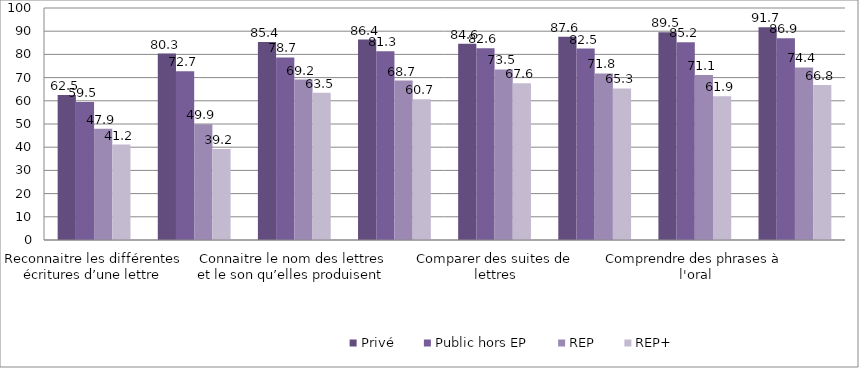
| Category | Privé | Public hors EP | REP | REP+ |
|---|---|---|---|---|
| Reconnaitre les différentes écritures d’une lettre | 62.51 | 59.47 | 47.92 | 41.15 |
| Comprendre des mots à l'oral | 80.34 | 72.71 | 49.92 | 39.19 |
| Connaitre le nom des lettres et le son qu’elles produisent  | 85.38 | 78.69 | 69.17 | 63.47 |
| Manipuler des syllabes  | 86.42 | 81.31 | 68.7 | 60.72 |
| Comparer des suites de lettres | 84.56 | 82.61 | 73.53 | 67.58 |
| Manipuler des phonèmes | 87.62 | 82.5 | 71.78 | 65.32 |
| Comprendre des phrases à l'oral | 89.52 | 85.22 | 71.08 | 61.91 |
| Comprendre des textes à l'oral | 91.65 | 86.92 | 74.4 | 66.8 |